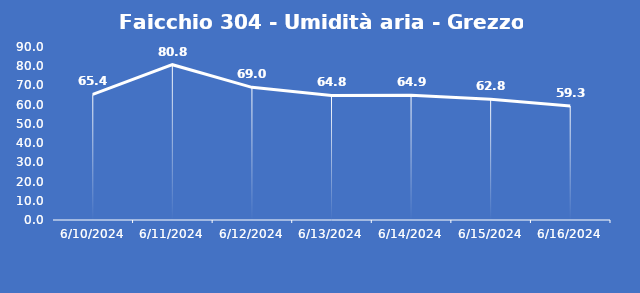
| Category | Faicchio 304 - Umidità aria - Grezzo (%) |
|---|---|
| 6/10/24 | 65.4 |
| 6/11/24 | 80.8 |
| 6/12/24 | 69 |
| 6/13/24 | 64.8 |
| 6/14/24 | 64.9 |
| 6/15/24 | 62.8 |
| 6/16/24 | 59.3 |